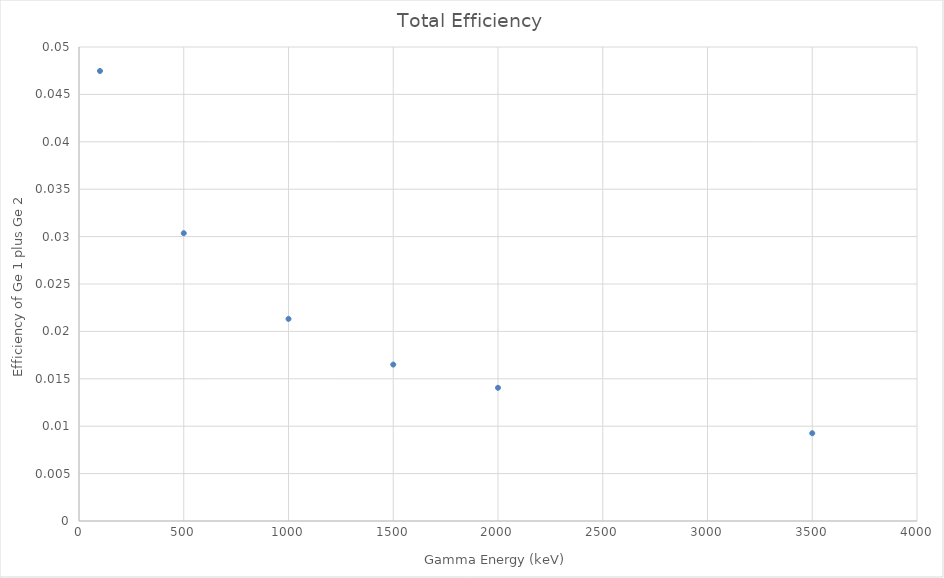
| Category | totEff |
|---|---|
| 100.0 | 0.047 |
| 500.0 | 0.03 |
| 1000.0 | 0.021 |
| 1500.0 | 0.016 |
| 2000.0 | 0.014 |
| 3500.0 | 0.009 |